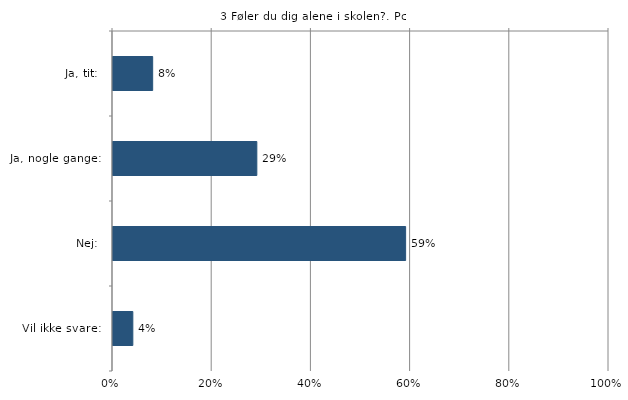
| Category | Føler du dig alene i skolen? |
|---|---|
| Ja, tit:  | 0.08 |
| Ja, nogle gange:  | 0.29 |
| Nej:  | 0.59 |
| Vil ikke svare:  | 0.04 |